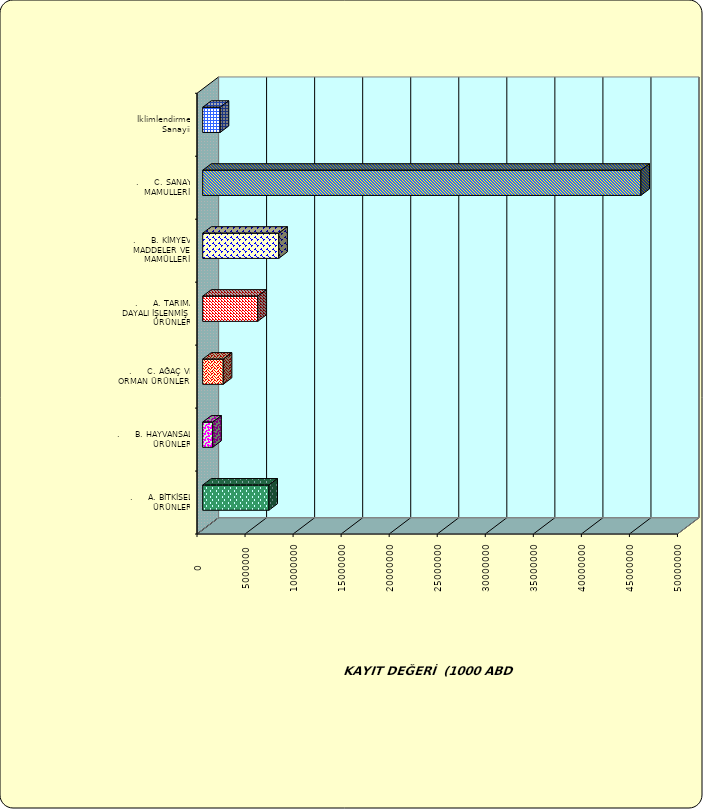
| Category | Series 0 |
|---|---|
| .     A. BİTKİSEL ÜRÜNLER | 6888401.041 |
| .     B. HAYVANSAL ÜRÜNLER | 1049226.963 |
| .     C. AĞAÇ VE ORMAN ÜRÜNLERİ | 2139190.031 |
| .     A. TARIMA DAYALI İŞLENMİŞ ÜRÜNLER | 5730346.62 |
| .     B. KİMYEVİ MADDELER VE MAMÜLLERİ | 7919123.987 |
| .     C. SANAYİ MAMULLERİ | 45602287.95 |
|  İklimlendirme Sanayii | 1820421.978 |